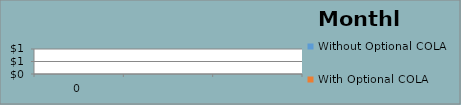
| Category | Without Optional COLA | With Optional COLA |
|---|---|---|
| 0 | 0 | 0 |